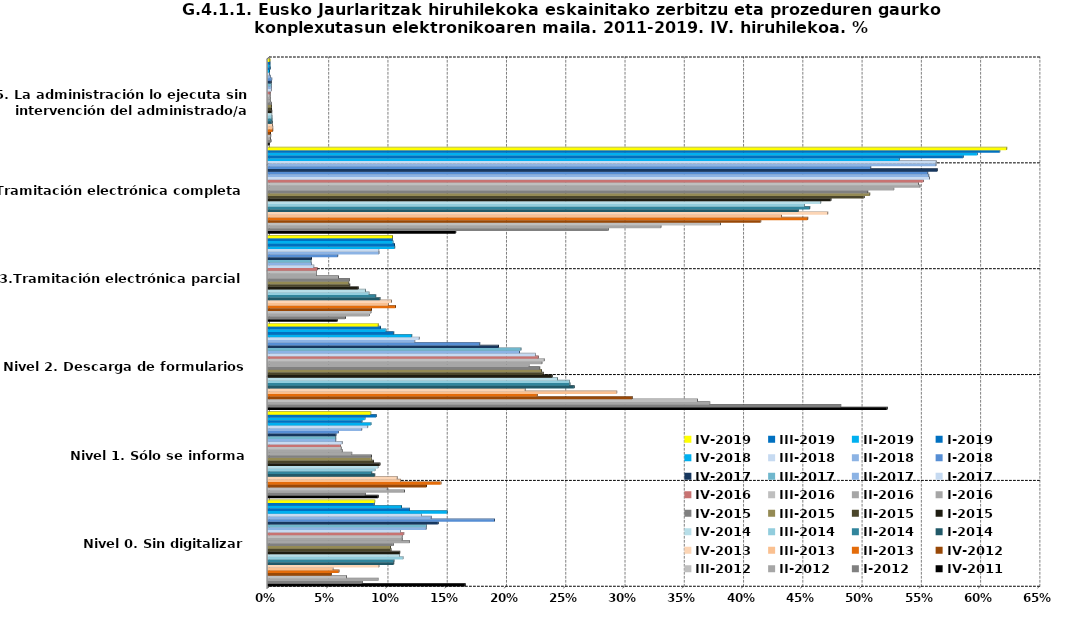
| Category | IV-2011 | I-2012 | II-2012 | III-2012 | IV-2012 | II-2013 | III-2013 | IV-2013 | I-2014 | II-2014 | III-2014 | IV-2014 | I-2015 | II-2015 | III-2015 | IV-2015 | I-2016 | II-2016 | III-2016 | IV-2016 | I-2017 | II-2017 | III-2017 | IV-2017 | I-2018 | II-2018 | III-2018 | IV-2018 | I-2019 | II-2019 | III-2019 | IV-2019 |
|---|---|---|---|---|---|---|---|---|---|---|---|---|---|---|---|---|---|---|---|---|---|---|---|---|---|---|---|---|---|---|---|---|
| Nivel 0. Sin digitalizar | 0.166 | 0.079 | 0.093 | 0.066 | 0.054 | 0.06 | 0.055 | 0.094 | 0.106 | 0.106 | 0.114 | 0.111 | 0.111 | 0.104 | 0.103 | 0.106 | 0.119 | 0.113 | 0.113 | 0.115 | 0.112 | 0.134 | 0.134 | 0.144 | 0.191 | 0.138 | 0.13 | 0.151 | 0.12 | 0.113 | 0.09 | 0.09 |
| Nivel 1. Sólo se informa | 0.093 | 0.082 | 0.115 | 0.101 | 0.134 | 0.146 | 0.112 | 0.109 | 0.09 | 0.087 | 0.09 | 0.093 | 0.095 | 0.089 | 0.087 | 0.087 | 0.071 | 0.063 | 0.062 | 0.061 | 0.063 | 0.057 | 0.057 | 0.057 | 0.06 | 0.079 | 0.084 | 0.087 | 0.079 | 0.082 | 0.091 | 0.087 |
| Nivel 2. Descarga de formularios | 0.522 | 0.483 | 0.373 | 0.362 | 0.307 | 0.227 | 0.294 | 0.217 | 0.258 | 0.255 | 0.254 | 0.244 | 0.24 | 0.232 | 0.231 | 0.229 | 0.22 | 0.231 | 0.233 | 0.228 | 0.226 | 0.212 | 0.213 | 0.194 | 0.179 | 0.124 | 0.128 | 0.121 | 0.106 | 0.1 | 0.095 | 0.093 |
| Nivel 3.Tramitación electrónica parcial | 0.059 | 0.065 | 0.086 | 0.087 | 0.087 | 0.108 | 0.102 | 0.104 | 0.094 | 0.091 | 0.085 | 0.082 | 0.076 | 0.069 | 0.068 | 0.069 | 0.059 | 0.041 | 0.041 | 0.042 | 0.039 | 0.037 | 0.036 | 0.037 | 0.059 | 0.094 | 0.094 | 0.107 | 0.107 | 0.106 | 0.105 | 0.105 |
| Nivel 4 Tramitación electrónica completa | 0.158 | 0.287 | 0.332 | 0.382 | 0.416 | 0.455 | 0.433 | 0.472 | 0.447 | 0.457 | 0.453 | 0.466 | 0.475 | 0.503 | 0.508 | 0.506 | 0.528 | 0.55 | 0.549 | 0.553 | 0.558 | 0.557 | 0.557 | 0.565 | 0.509 | 0.564 | 0.564 | 0.532 | 0.587 | 0.598 | 0.617 | 0.623 |
| Nivel 5. La administración lo ejecuta sin intervención del administrado/a | 0.001 | 0.003 | 0.002 | 0.002 | 0.002 | 0.004 | 0.004 | 0.004 | 0.004 | 0.003 | 0.003 | 0.003 | 0.003 | 0.003 | 0.003 | 0.003 | 0.002 | 0.002 | 0.002 | 0.002 | 0.003 | 0.003 | 0.003 | 0.003 | 0.003 | 0.002 | 0.001 | 0.001 | 0.002 | 0.002 | 0.002 | 0.002 |